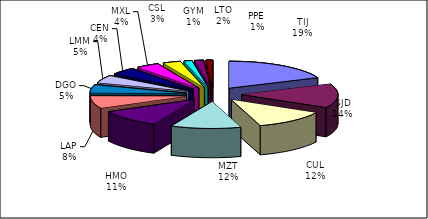
| Category | Series 0 | Series 1 | Series 2 | Series 3 |
|---|---|---|---|---|
| TIJ | 67146 | 62281 | 4865 | 67146 |
| SJD | 51815 | 51078 | 737 | 51815 |
| CUL | 44040 | 23940 | 20100 | 44040 |
| MZT | 42484 | 33739 | 8745 | 42484 |
| HMO | 38332 | 25306 | 13026 | 38332 |
| LAP | 27393 | 14115 | 13278 | 27393 |
| DGO | 17862 | 9110 | 8752 | 17862 |
| LMM | 16691 | 6759 | 9932 | 16691 |
| CEN | 15737 | 5940 | 9797 | 15737 |
| MXL | 14184 | 9329 | 4855 | 14184 |
| CSL | 10776 | 7620 | 3156 | 10776 |
| GYM | 4803 | 731 | 4072 | 4803 |
| LTO | 5581 | 2409 | 3172 | 5581 |
| PPE | 4083 | 259 | 3824 | 4083 |